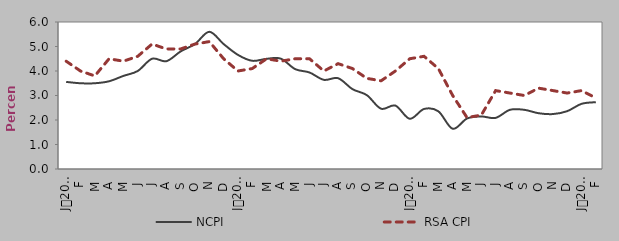
| Category | NCPI | RSA CPI |
|---|---|---|
| 0 | 3.555 | 4.4 |
| 1900-01-01 | 3.5 | 4 |
| 1900-01-02 | 3.5 | 3.8 |
| 1900-01-03 | 3.581 | 4.5 |
| 1900-01-04 | 3.8 | 4.4 |
| 1900-01-05 | 4 | 4.6 |
| 1900-01-06 | 4.5 | 5.1 |
| 1900-01-07 | 4.4 | 4.9 |
| 1900-01-08 | 4.8 | 4.9 |
| 1900-01-09 | 5.1 | 5.1 |
| 1900-01-10 | 5.6 | 5.2 |
| 1900-01-11 | 5.1 | 4.5 |
| 1900-01-12 | 4.658 | 4 |
| 1900-01-13 | 4.416 | 4.1 |
| 1900-01-14 | 4.498 | 4.5 |
| 1900-01-15 | 4.503 | 4.4 |
| 1900-01-16 | 4.076 | 4.5 |
| 1900-01-17 | 3.939 | 4.5 |
| 1900-01-18 | 3.639 | 4 |
| 1900-01-19 | 3.705 | 4.3 |
| 1900-01-20 | 3.259 | 4.1 |
| 1900-01-21 | 3.015 | 3.7 |
| 1900-01-22 | 2.461 | 3.6 |
| 1900-01-23 | 2.588 | 4 |
| 1900-01-24 | 2.05 | 4.5 |
| 1900-01-25 | 2.45 | 4.6 |
| 1900-01-26 | 2.354 | 4.1 |
| 1900-01-27 | 1.643 | 3 |
| 1900-01-28 | 2.06 | 2.1 |
| 1900-01-29 | 2.145 | 2.2 |
| 1900-01-30 | 2.087 | 3.2 |
| 1900-01-31 | 2.416 | 3.1 |
| 1900-02-01 | 2.416 | 3 |
| 1900-02-02 | 2.277 | 3.3 |
| 1900-02-03 | 2.242 | 3.2 |
| 1900-02-04 | 2.361 | 3.1 |
| 1900-02-05 | 2.66 | 3.2 |
| 1900-02-06 | 2.728 | 2.9 |